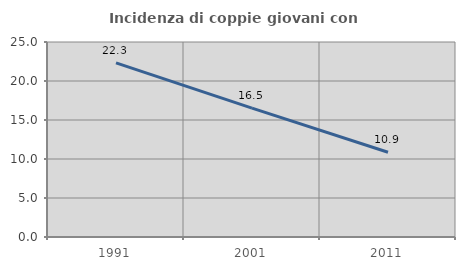
| Category | Incidenza di coppie giovani con figli |
|---|---|
| 1991.0 | 22.323 |
| 2001.0 | 16.517 |
| 2011.0 | 10.868 |